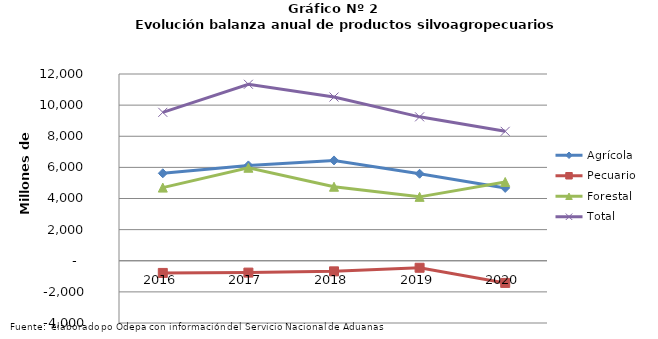
| Category | Agrícola | Pecuario | Forestal | Total |
|---|---|---|---|---|
| 2016.0 | 5619304 | -782654 | 4700192 | 9536842 |
| 2017.0 | 6126434 | -761998 | 5976134 | 11340570 |
| 2018.0 | 6446329 | -681646 | 4755333 | 10520016 |
| 2019.0 | 5590965 | -450130 | 4105622 | 9246457 |
| 2020.0 | 4679749 | -1424906 | 5060797 | 8315640 |